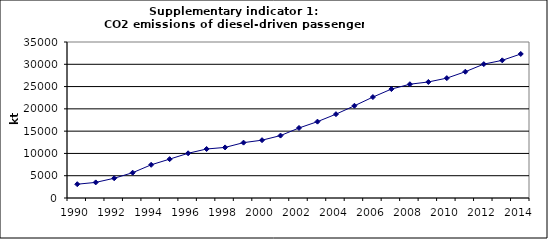
| Category | CO2 emissions of diesel-driven passenger cars, kt |
|---|---|
| 1990 | 3094.743 |
| 1991 | 3501.371 |
| 1992 | 4433.16 |
| 1993 | 5678.057 |
| 1994 | 7446.969 |
| 1995 | 8721.834 |
| 1996 | 10032.838 |
| 1997 | 10996.973 |
| 1998 | 11349.961 |
| 1999 | 12421.16 |
| 2000 | 12971.477 |
| 2001 | 14003.938 |
| 2002 | 15711.786 |
| 2003 | 17130.188 |
| 2004 | 18804.195 |
| 2005 | 20690.981 |
| 2006 | 22644.806 |
| 2007 | 24438.74 |
| 2008 | 25525.42 |
| 2009 | 26033.073 |
| 2010 | 26892.808 |
| 2011 | 28334.581 |
| 2012 | 30038.715 |
| 2013 | 30887.262 |
| 2014 | 32311.347 |